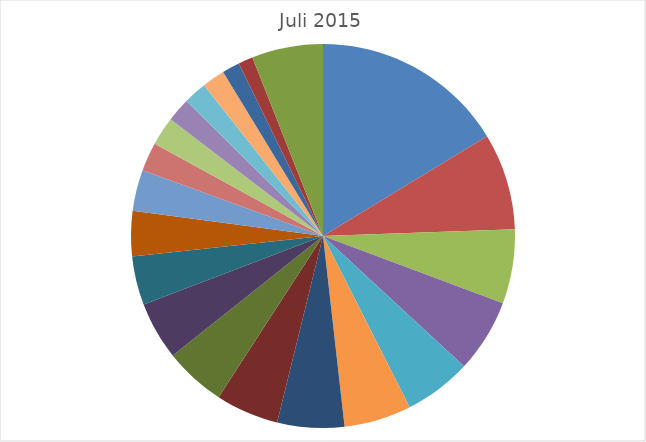
| Category | Juli 2015 |
|---|---|
| VW | 4388 |
| Opel | 2191 |
| Skoda | 1681 |
| Audi | 1666 |
| Hyundai | 1525 |
| Seat | 1525 |
| Ford | 1517 |
| BMW | 1427 |
| Mercedes | 1390 |
| Renault | 1314 |
| Fiat | 1107 |
| Mazda | 1019 |
| Peugeot | 934 |
| Kia | 653 |
| Citroen | 652 |
| Dacia | 538 |
| Suzuki | 527 |
| Nissan | 519 |
| Toyota | 401 |
| Volvo | 330 |
| Sonstige | 1613 |